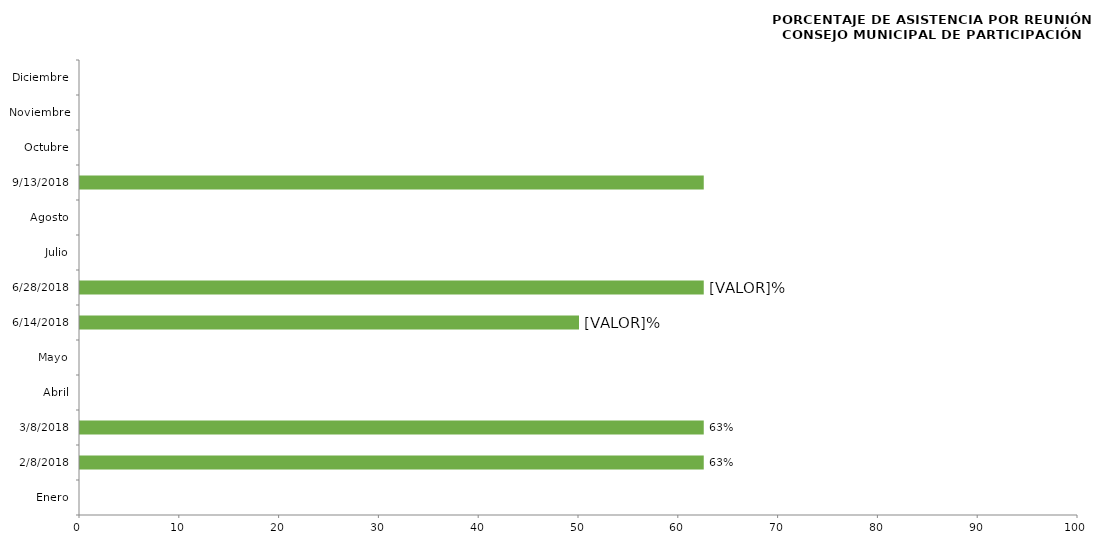
| Category | Series 0 |
|---|---|
| Enero | 0 |
| 08/02/2018 | 62.5 |
| 08/03/2018 | 62.5 |
| Abril | 0 |
| Mayo | 0 |
| 14/06/2018 | 50 |
| 28/06/2018 | 62.5 |
| Julio | 0 |
| Agosto | 0 |
| 13/09/2018 | 62.5 |
| Octubre | 0 |
| Noviembre | 0 |
| Diciembre | 0 |